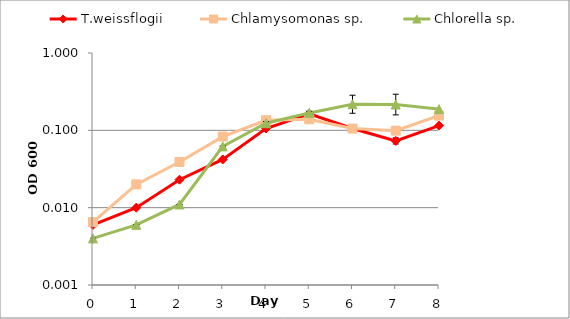
| Category | T.weissflogii | Chlamysomonas sp. | Chlorella sp. |
|---|---|---|---|
| 0.0 | 0.006 | 0.006 | 0.004 |
| 1.0 | 0.01 | 0.02 | 0.006 |
| 2.0 | 0.023 | 0.039 | 0.011 |
| 3.0 | 0.042 | 0.083 | 0.062 |
| 4.0 | 0.106 | 0.135 | 0.124 |
| 5.0 | 0.164 | 0.139 | 0.168 |
| 6.0 | 0.106 | 0.106 | 0.218 |
| 7.0 | 0.073 | 0.099 | 0.216 |
| 8.0 | 0.115 | 0.155 | 0.188 |